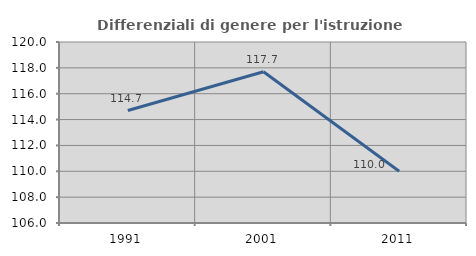
| Category | Differenziali di genere per l'istruzione superiore |
|---|---|
| 1991.0 | 114.702 |
| 2001.0 | 117.701 |
| 2011.0 | 110.006 |